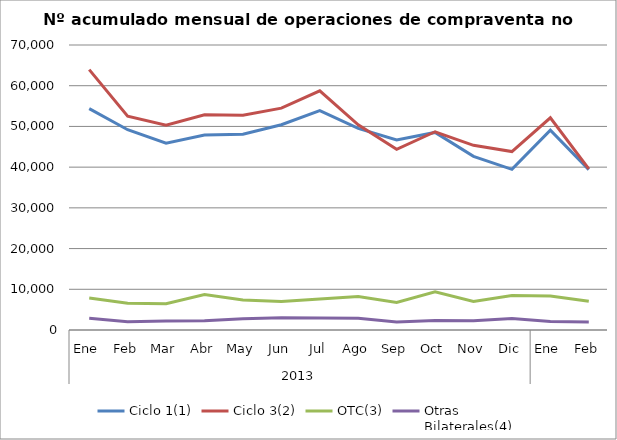
| Category | Ciclo 1(1) | Ciclo 3(2) | OTC(3) | Otras
Bilaterales(4) |
|---|---|---|---|---|
| 0 | 54386 | 63960 | 7873 | 2891 |
| 1 | 49196 | 52525 | 6550 | 2012 |
| 2 | 45892 | 50320 | 6475 | 2233 |
| 3 | 47876 | 52874 | 8686 | 2274 |
| 4 | 48091 | 52767 | 7394 | 2733 |
| 5 | 50415 | 54485 | 6994 | 3021 |
| 6 | 53879 | 58744 | 7586 | 2959 |
| 7 | 49504 | 50401 | 8243 | 2889 |
| 8 | 46688 | 44370 | 6784 | 1951 |
| 9 | 48531 | 48693 | 9357 | 2324 |
| 10 | 42642 | 45362 | 7000 | 2275 |
| 11 | 39447 | 43831 | 8487 | 2831 |
| 12 | 49087 | 52117 | 8357 | 2090 |
| 13 | 39397 | 39565 | 7045 | 1958 |